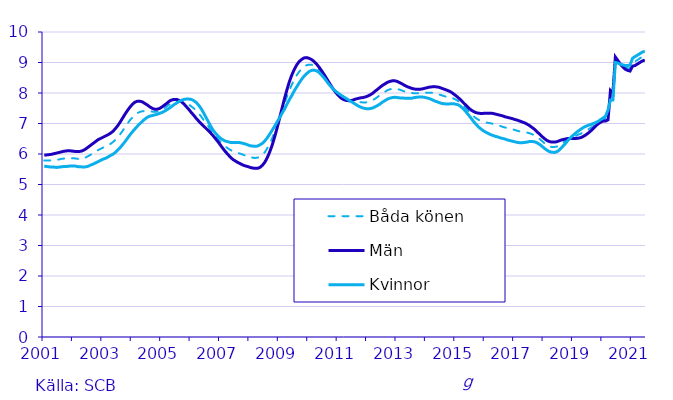
| Category | Båda könen | Män  | Kvinnor |
|---|---|---|---|
| 2001.0 | 5.79 | 5.97 | 5.6 |
| nan | 5.79 | 5.97 | 5.59 |
| nan | 5.79 | 5.98 | 5.58 |
| nan | 5.79 | 5.99 | 5.57 |
| nan | 5.8 | 6.01 | 5.57 |
| nan | 5.81 | 6.03 | 5.56 |
| nan | 5.82 | 6.05 | 5.57 |
| nan | 5.84 | 6.07 | 5.58 |
| nan | 5.85 | 6.09 | 5.59 |
| nan | 5.86 | 6.1 | 5.59 |
| nan | 5.87 | 6.11 | 5.6 |
| nan | 5.86 | 6.1 | 5.61 |
| nan | 5.86 | 6.09 | 5.61 |
| nan | 5.85 | 6.08 | 5.6 |
| nan | 5.84 | 6.08 | 5.58 |
| nan | 5.85 | 6.09 | 5.58 |
| nan | 5.86 | 6.12 | 5.57 |
| nan | 5.89 | 6.17 | 5.58 |
| nan | 5.93 | 6.23 | 5.6 |
| nan | 5.98 | 6.29 | 5.64 |
| nan | 6.03 | 6.35 | 5.67 |
| nan | 6.08 | 6.41 | 5.71 |
| nan | 6.13 | 6.47 | 5.75 |
| nan | 6.17 | 6.51 | 5.79 |
| 2003.0 | 6.21 | 6.55 | 5.83 |
| nan | 6.24 | 6.59 | 5.86 |
| nan | 6.28 | 6.63 | 5.9 |
| nan | 6.33 | 6.68 | 5.95 |
| nan | 6.39 | 6.74 | 5.99 |
| nan | 6.46 | 6.83 | 6.05 |
| nan | 6.55 | 6.93 | 6.13 |
| nan | 6.65 | 7.05 | 6.21 |
| nan | 6.76 | 7.18 | 6.31 |
| nan | 6.88 | 7.31 | 6.41 |
| nan | 7 | 7.43 | 6.52 |
| nan | 7.11 | 7.54 | 6.63 |
| nan | 7.2 | 7.63 | 6.73 |
| nan | 7.28 | 7.7 | 6.82 |
| nan | 7.34 | 7.73 | 6.91 |
| nan | 7.38 | 7.73 | 6.99 |
| nan | 7.4 | 7.71 | 7.07 |
| nan | 7.41 | 7.66 | 7.14 |
| nan | 7.41 | 7.61 | 7.2 |
| nan | 7.4 | 7.55 | 7.24 |
| nan | 7.39 | 7.5 | 7.26 |
| nan | 7.38 | 7.47 | 7.28 |
| nan | 7.39 | 7.47 | 7.3 |
| nan | 7.41 | 7.49 | 7.33 |
| 2005.0 | 7.45 | 7.54 | 7.36 |
| nan | 7.5 | 7.6 | 7.4 |
| nan | 7.56 | 7.66 | 7.45 |
| nan | 7.62 | 7.73 | 7.5 |
| nan | 7.67 | 7.77 | 7.56 |
| nan | 7.71 | 7.79 | 7.62 |
| nan | 7.73 | 7.79 | 7.67 |
| nan | 7.74 | 7.76 | 7.72 |
| nan | 7.73 | 7.71 | 7.76 |
| nan | 7.71 | 7.64 | 7.79 |
| nan | 7.67 | 7.55 | 7.8 |
| nan | 7.62 | 7.46 | 7.8 |
| nan | 7.56 | 7.36 | 7.79 |
| nan | 7.5 | 7.27 | 7.75 |
| nan | 7.42 | 7.17 | 7.69 |
| nan | 7.33 | 7.08 | 7.6 |
| nan | 7.23 | 7 | 7.49 |
| nan | 7.12 | 6.92 | 7.35 |
| nan | 7.01 | 6.84 | 7.2 |
| nan | 6.9 | 6.76 | 7.05 |
| nan | 6.79 | 6.68 | 6.9 |
| nan | 6.68 | 6.59 | 6.77 |
| nan | 6.58 | 6.49 | 6.67 |
| nan | 6.48 | 6.39 | 6.58 |
| 2007.0 | 6.39 | 6.28 | 6.51 |
| nan | 6.31 | 6.17 | 6.46 |
| nan | 6.24 | 6.07 | 6.42 |
| nan | 6.18 | 5.98 | 6.4 |
| nan | 6.13 | 5.89 | 6.38 |
| nan | 6.09 | 5.82 | 6.38 |
| nan | 6.06 | 5.77 | 6.38 |
| nan | 6.03 | 5.72 | 6.38 |
| nan | 6.01 | 5.68 | 6.37 |
| nan | 5.98 | 5.64 | 6.35 |
| nan | 5.95 | 5.61 | 6.33 |
| nan | 5.93 | 5.59 | 6.3 |
| nan | 5.9 | 5.56 | 6.27 |
| nan | 5.88 | 5.54 | 6.26 |
| nan | 5.87 | 5.53 | 6.25 |
| nan | 5.88 | 5.53 | 6.26 |
| nan | 5.91 | 5.56 | 6.3 |
| nan | 5.97 | 5.63 | 6.35 |
| nan | 6.06 | 5.73 | 6.43 |
| nan | 6.19 | 5.88 | 6.53 |
| nan | 6.34 | 6.07 | 6.65 |
| nan | 6.52 | 6.29 | 6.78 |
| nan | 6.72 | 6.56 | 6.91 |
| nan | 6.95 | 6.85 | 7.05 |
| 2009.0 | 7.18 | 7.17 | 7.19 |
| nan | 7.41 | 7.49 | 7.33 |
| nan | 7.65 | 7.81 | 7.47 |
| nan | 7.88 | 8.1 | 7.63 |
| nan | 8.09 | 8.37 | 7.78 |
| nan | 8.27 | 8.59 | 7.92 |
| nan | 8.44 | 8.77 | 8.07 |
| nan | 8.58 | 8.92 | 8.2 |
| nan | 8.7 | 9.03 | 8.33 |
| nan | 8.79 | 9.1 | 8.45 |
| nan | 8.86 | 9.15 | 8.55 |
| nan | 8.91 | 9.16 | 8.63 |
| nan | 8.93 | 9.14 | 8.7 |
| nan | 8.93 | 9.1 | 8.74 |
| nan | 8.9 | 9.04 | 8.75 |
| nan | 8.85 | 8.96 | 8.73 |
| nan | 8.77 | 8.86 | 8.68 |
| nan | 8.68 | 8.75 | 8.6 |
| nan | 8.57 | 8.63 | 8.51 |
| nan | 8.46 | 8.5 | 8.41 |
| nan | 8.34 | 8.37 | 8.3 |
| nan | 8.22 | 8.24 | 8.21 |
| nan | 8.12 | 8.12 | 8.12 |
| nan | 8.03 | 8.01 | 8.05 |
| 2011.0 | 7.95 | 7.92 | 7.99 |
| nan | 7.88 | 7.84 | 7.93 |
| nan | 7.83 | 7.79 | 7.88 |
| nan | 7.79 | 7.76 | 7.83 |
| nan | 7.76 | 7.75 | 7.78 |
| nan | 7.74 | 7.75 | 7.73 |
| nan | 7.73 | 7.77 | 7.68 |
| nan | 7.72 | 7.8 | 7.63 |
| nan | 7.71 | 7.82 | 7.58 |
| nan | 7.7 | 7.84 | 7.54 |
| nan | 7.69 | 7.85 | 7.51 |
| nan | 7.69 | 7.87 | 7.49 |
| nan | 7.7 | 7.9 | 7.48 |
| nan | 7.73 | 7.94 | 7.49 |
| nan | 7.77 | 7.99 | 7.51 |
| nan | 7.81 | 8.06 | 7.55 |
| nan | 7.87 | 8.12 | 7.59 |
| nan | 7.93 | 8.19 | 7.64 |
| nan | 7.99 | 8.25 | 7.7 |
| nan | 8.04 | 8.3 | 7.75 |
| nan | 8.09 | 8.35 | 7.8 |
| nan | 8.12 | 8.38 | 7.83 |
| nan | 8.14 | 8.4 | 7.85 |
| nan | 8.14 | 8.4 | 7.86 |
| 2013.0 | 8.13 | 8.38 | 7.85 |
| nan | 8.11 | 8.34 | 7.84 |
| nan | 8.08 | 8.3 | 7.84 |
| nan | 8.05 | 8.25 | 7.83 |
| nan | 8.03 | 8.21 | 7.83 |
| nan | 8.01 | 8.18 | 7.83 |
| nan | 8 | 8.15 | 7.83 |
| nan | 7.99 | 8.13 | 7.85 |
| nan | 7.99 | 8.12 | 7.86 |
| nan | 8 | 8.12 | 7.87 |
| nan | 8.01 | 8.13 | 7.87 |
| nan | 8.01 | 8.15 | 7.86 |
| nan | 8.01 | 8.17 | 7.84 |
| nan | 8.01 | 8.19 | 7.82 |
| nan | 8.01 | 8.2 | 7.79 |
| nan | 7.99 | 8.21 | 7.75 |
| nan | 7.97 | 8.2 | 7.72 |
| nan | 7.95 | 8.19 | 7.69 |
| nan | 7.93 | 8.16 | 7.66 |
| nan | 7.9 | 8.13 | 7.65 |
| nan | 7.88 | 8.1 | 7.64 |
| nan | 7.87 | 8.07 | 7.64 |
| nan | 7.85 | 8.03 | 7.65 |
| nan | 7.82 | 7.97 | 7.65 |
| 2015.0 | 7.78 | 7.91 | 7.63 |
| nan | 7.73 | 7.84 | 7.61 |
| nan | 7.67 | 7.77 | 7.55 |
| nan | 7.59 | 7.68 | 7.48 |
| nan | 7.5 | 7.6 | 7.39 |
| nan | 7.41 | 7.52 | 7.29 |
| nan | 7.32 | 7.45 | 7.19 |
| nan | 7.25 | 7.4 | 7.08 |
| nan | 7.18 | 7.36 | 6.99 |
| nan | 7.13 | 7.34 | 6.9 |
| nan | 7.09 | 7.33 | 6.83 |
| nan | 7.06 | 7.33 | 6.77 |
| nan | 7.04 | 7.34 | 6.72 |
| nan | 7.02 | 7.34 | 6.68 |
| nan | 7.01 | 7.34 | 6.64 |
| nan | 6.99 | 7.33 | 6.61 |
| nan | 6.96 | 7.31 | 6.58 |
| nan | 6.94 | 7.29 | 6.56 |
| nan | 6.92 | 7.27 | 6.53 |
| nan | 6.89 | 7.25 | 6.51 |
| nan | 6.87 | 7.22 | 6.49 |
| nan | 6.85 | 7.2 | 6.46 |
| nan | 6.83 | 7.18 | 6.44 |
| nan | 6.81 | 7.16 | 6.42 |
| 2017.0 | 6.79 | 7.13 | 6.4 |
| nan | 6.76 | 7.11 | 6.38 |
| nan | 6.74 | 7.08 | 6.37 |
| nan | 6.73 | 7.05 | 6.37 |
| nan | 6.71 | 7.02 | 6.38 |
| nan | 6.7 | 6.98 | 6.39 |
| nan | 6.68 | 6.93 | 6.41 |
| nan | 6.65 | 6.87 | 6.41 |
| nan | 6.61 | 6.81 | 6.4 |
| nan | 6.56 | 6.73 | 6.37 |
| nan | 6.5 | 6.66 | 6.32 |
| nan | 6.43 | 6.58 | 6.26 |
| nan | 6.36 | 6.51 | 6.19 |
| nan | 6.3 | 6.45 | 6.13 |
| nan | 6.26 | 6.41 | 6.08 |
| nan | 6.23 | 6.39 | 6.06 |
| nan | 6.23 | 6.39 | 6.05 |
| nan | 6.24 | 6.4 | 6.07 |
| nan | 6.28 | 6.43 | 6.12 |
| nan | 6.33 | 6.46 | 6.2 |
| nan | 6.39 | 6.48 | 6.29 |
| nan | 6.44 | 6.5 | 6.38 |
| nan | 6.49 | 6.51 | 6.48 |
| nan | 6.53 | 6.51 | 6.56 |
| 2019.0 | 6.57 | 6.51 | 6.63 |
| nan | 6.6 | 6.51 | 6.7 |
| nan | 6.64 | 6.52 | 6.76 |
| nan | 6.67 | 6.54 | 6.82 |
| nan | 6.72 | 6.58 | 6.87 |
| nan | 6.76 | 6.63 | 6.91 |
| nan | 6.81 | 6.69 | 6.94 |
| nan | 6.86 | 6.76 | 6.97 |
| nan | 6.91 | 6.84 | 7 |
| nan | 6.97 | 6.92 | 7.03 |
| nan | 7.03 | 6.99 | 7.07 |
| nan | 7.08 | 7.04 | 7.13 |
| nan | 7.13 | 7.08 | 7.18 |
| nan | 7.16 | 7.08 | 7.24 |
| nan | 7.27 | 7.12 | 7.44 |
| nan | 7.93 | 8.08 | 7.77 |
| nan | 7.89 | 7.99 | 7.77 |
| nan | 9.1 | 9.18 | 9 |
| nan | 9.03 | 9.07 | 8.98 |
| nan | 8.95 | 8.95 | 8.95 |
| nan | 8.89 | 8.86 | 8.92 |
| nan | 8.84 | 8.78 | 8.9 |
| nan | 8.81 | 8.74 | 8.9 |
| nan | 8.81 | 8.72 | 8.92 |
| 2021.0 | 9 | 8.88 | 9.14 |
| nan | 9.04 | 8.9 | 9.19 |
| nan | 9.08 | 8.95 | 9.24 |
| nan | 9.14 | 9 | 9.29 |
| nan | 9.18 | 9.05 | 9.34 |
| nan | 9.22 | 9.08 | 9.37 |